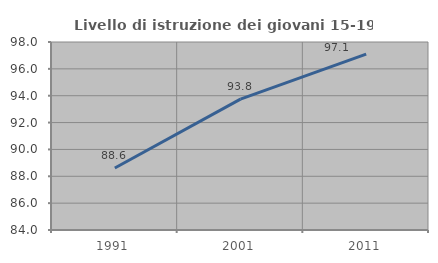
| Category | Livello di istruzione dei giovani 15-19 anni |
|---|---|
| 1991.0 | 88.618 |
| 2001.0 | 93.75 |
| 2011.0 | 97.101 |